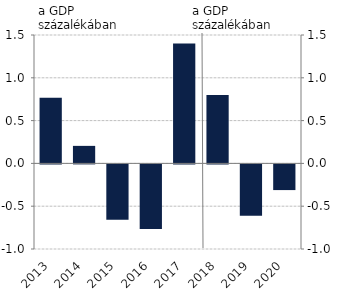
| Category | Fiskális impulzus |
|---|---|
| 2013.0 | 0.768 |
| 2014.0 | 0.205 |
| 2015.0 | -0.646 |
| 2016.0 | -0.755 |
| 2017.0 | 1.4 |
| 2018.0 | 0.8 |
| 2019.0 | -0.6 |
| 2020.0 | -0.3 |